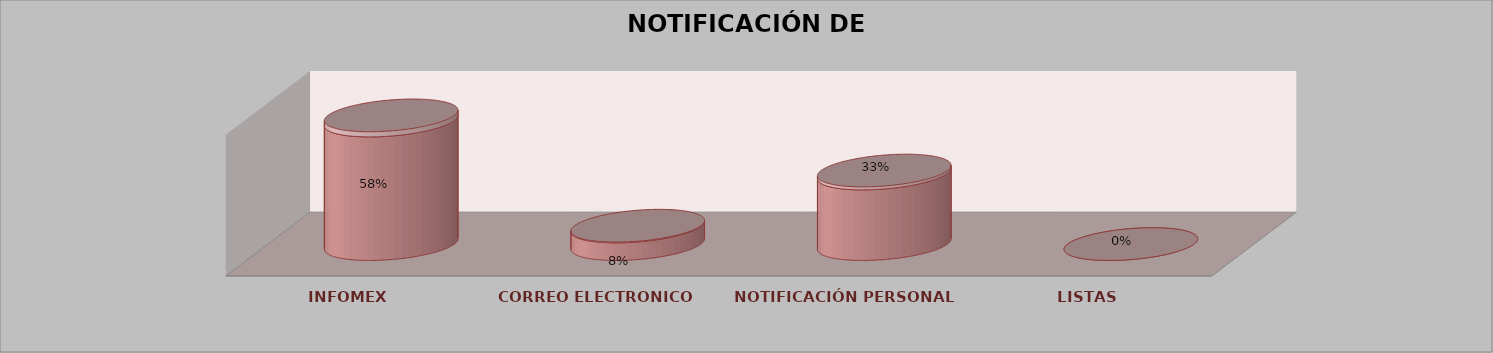
| Category | Series 0 | Series 1 | Series 2 | Series 3 | Series 4 |
|---|---|---|---|---|---|
| INFOMEX |  |  |  | 14 | 0.583 |
| CORREO ELECTRONICO |  |  |  | 2 | 0.083 |
| NOTIFICACIÓN PERSONAL |  |  |  | 8 | 0.333 |
| LISTAS |  |  |  | 0 | 0 |